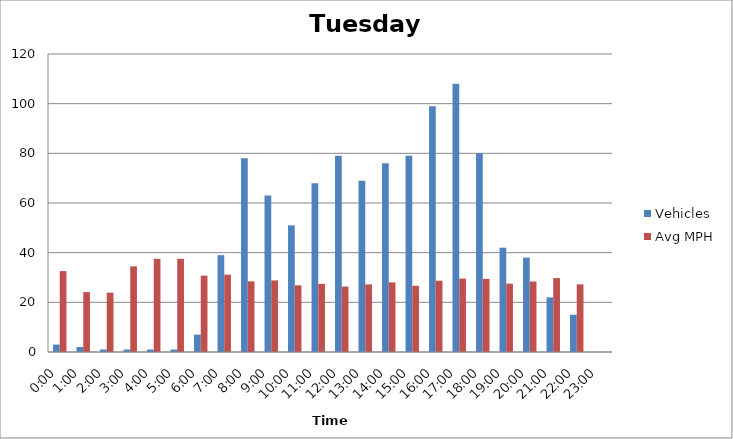
| Category | Vehicles | Avg MPH |
|---|---|---|
| 0:00 | 3 | 32.58 |
| 1:00 | 2 | 24.13 |
| 2:00 | 1 | 23.9 |
| 3:00 | 1 | 34.49 |
| 4:00 | 1 | 37.52 |
| 5:00 | 1 | 37.53 |
| 6:00 | 7 | 30.74 |
| 7:00 | 39 | 31.13 |
| 8:00 | 78 | 28.45 |
| 9:00 | 63 | 28.82 |
| 10:00 | 51 | 26.86 |
| 11:00 | 68 | 27.44 |
| 12:00 | 79 | 26.35 |
| 13:00 | 69 | 27.22 |
| 14:00 | 76 | 28.04 |
| 15:00 | 79 | 26.68 |
| 16:00 | 99 | 28.71 |
| 17:00 | 108 | 29.56 |
| 18:00 | 80 | 29.44 |
| 19:00 | 42 | 27.53 |
| 20:00 | 38 | 28.4 |
| 21:00 | 22 | 29.77 |
| 22:00 | 15 | 27.25 |
| 23:00 | 0 | 0 |